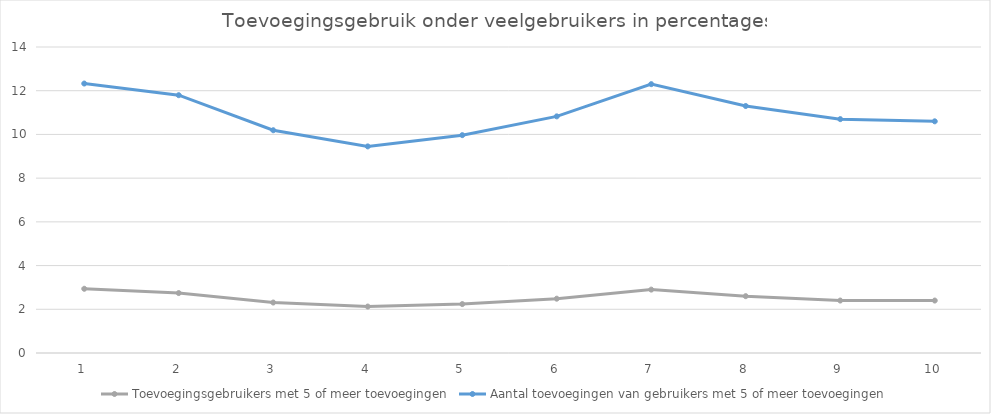
| Category | Toevoegingsgebruikers met 5 of meer toevoegingen | Aantal toevoegingen van gebruikers met 5 of meer toevoegingen |
|---|---|---|
| 0 | 2.939 | 12.328 |
| 1 | 2.742 | 11.795 |
| 2 | 2.309 | 10.191 |
| 3 | 2.125 | 9.452 |
| 4 | 2.238 | 9.967 |
| 5 | 2.485 | 10.827 |
| 6 | 2.9 | 12.3 |
| 7 | 2.6 | 11.3 |
| 8 | 2.4 | 10.7 |
| 9 | 2.4 | 10.6 |